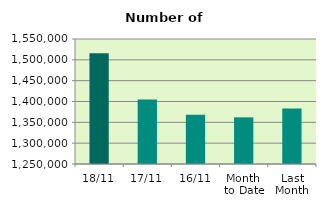
| Category | Series 0 |
|---|---|
| 18/11 | 1515576 |
| 17/11 | 1404952 |
| 16/11 | 1368314 |
| Month 
to Date | 1361923.286 |
| Last
Month | 1383348.571 |